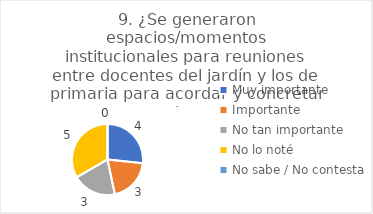
| Category | 9. ¿Se generaron espacios/momentos institucionales para reuniones entre docentes del jardín y los de primaria para acordar y concretar acciones? |
|---|---|
| Muy importante  | 0.267 |
| Importante  | 0.2 |
| No tan importante  | 0.2 |
| No lo noté  | 0.333 |
| No sabe / No contesta | 0 |